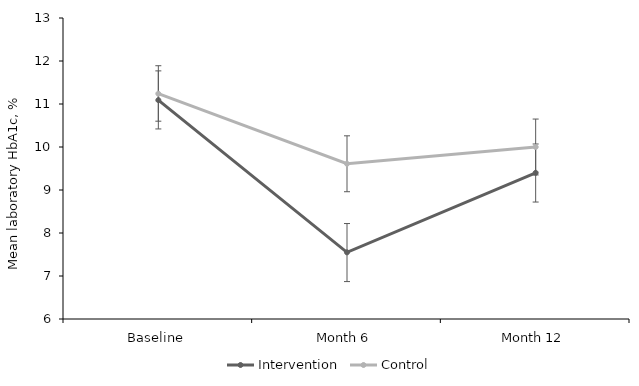
| Category | Intervention | Control |
|---|---|---|
| Baseline | 11.09 | 11.24 |
| Month 6 | 7.55 | 9.61 |
| Month 12 | 9.4 | 10 |